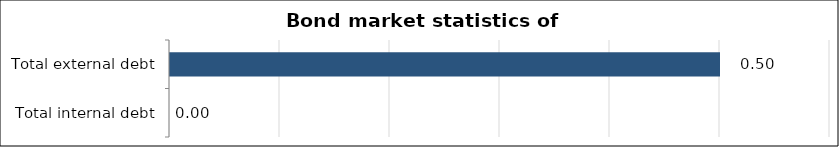
| Category | Bond market statistics of Tajikistan |
|---|---|
| Total internal debt | 0 |
| Total external debt | 0.5 |